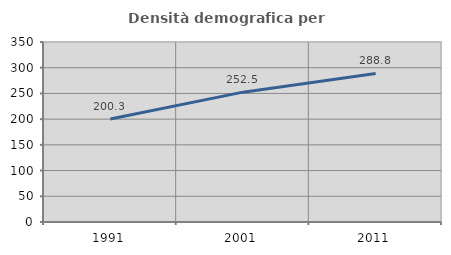
| Category | Densità demografica |
|---|---|
| 1991.0 | 200.301 |
| 2001.0 | 252.49 |
| 2011.0 | 288.782 |